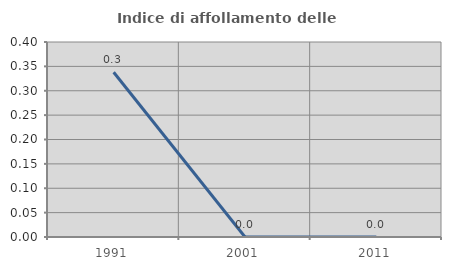
| Category | Indice di affollamento delle abitazioni  |
|---|---|
| 1991.0 | 0.338 |
| 2001.0 | 0 |
| 2011.0 | 0 |